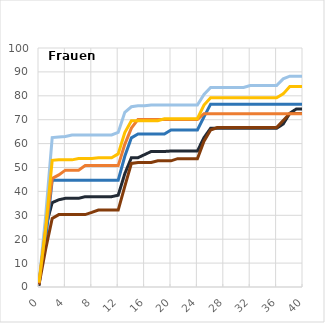
| Category | 1,00 Nichtmigranten - max einfacher Hauptschulabschluss | 2,00 Nichtmigranten - qualifizierender Hauptschulabschluss | 3,00 Nichtmigranten - mittlerer Schulabschluss | 4,00 Migranten - max einfacher Hauptschulabschluss | 5,00 Migranten - qualifizierender Hauptschulabschluss | 6,00 Migranten - mittlerer Schulabschluss |
|---|---|---|---|---|---|---|
| 0.0 | 0.5 | 2.5 | 1.7 | 0.9 | 1.5 | 1.9 |
| 1.0 | 24.9 | 19.2 | 29.4 | 15.7 | 23.9 | 24.3 |
| 2.0 | 35.3 | 44.7 | 62.5 | 28.7 | 45.4 | 53 |
| 3.0 | 36.5 | 44.7 | 62.8 | 30.3 | 46.9 | 53.2 |
| 4.0 | 37.1 | 44.7 | 63 | 30.3 | 48.9 | 53.2 |
| 5.0 | 37.1 | 44.7 | 63.6 | 30.3 | 48.9 | 53.2 |
| 6.0 | 37.1 | 44.7 | 63.6 | 30.3 | 48.9 | 53.8 |
| 7.0 | 37.8 | 44.7 | 63.6 | 30.3 | 50.8 | 53.8 |
| 8.0 | 37.8 | 44.7 | 63.6 | 31.2 | 50.8 | 53.8 |
| 9.0 | 37.8 | 44.7 | 63.6 | 32.2 | 50.8 | 54.1 |
| 10.0 | 37.8 | 44.7 | 63.6 | 32.2 | 50.8 | 54.1 |
| 11.0 | 37.8 | 44.7 | 63.6 | 32.2 | 50.8 | 54.1 |
| 12.0 | 38.4 | 44.7 | 64.7 | 32.2 | 50.8 | 55.7 |
| 13.0 | 47.4 | 54.7 | 73.1 | 42.1 | 59.7 | 64.6 |
| 14.0 | 54.1 | 62.4 | 75.4 | 51.7 | 66.5 | 69.6 |
| 15.0 | 54.1 | 64 | 75.8 | 52.1 | 70.1 | 69.6 |
| 16.0 | 55.4 | 64 | 75.8 | 52.1 | 70.1 | 69.6 |
| 17.0 | 56.7 | 64 | 76.1 | 52.1 | 70.1 | 69.6 |
| 18.0 | 56.7 | 64 | 76.1 | 52.8 | 70.1 | 69.6 |
| 19.0 | 56.7 | 64 | 76.1 | 52.8 | 70.1 | 70.4 |
| 20.0 | 56.9 | 65.7 | 76.1 | 52.8 | 70.1 | 70.4 |
| 21.0 | 56.9 | 65.7 | 76.1 | 53.7 | 70.1 | 70.4 |
| 22.0 | 56.9 | 65.7 | 76.1 | 53.7 | 70.1 | 70.4 |
| 23.0 | 56.9 | 65.7 | 76.1 | 53.7 | 70.1 | 70.4 |
| 24.0 | 56.9 | 65.7 | 76.1 | 53.7 | 70.1 | 70.4 |
| 25.0 | 62.5 | 71.2 | 80.6 | 61 | 72.5 | 76.1 |
| 26.0 | 66.4 | 76.5 | 83.5 | 65.7 | 72.5 | 79.2 |
| 27.0 | 66.4 | 76.5 | 83.5 | 66.7 | 72.5 | 79.2 |
| 28.0 | 66.4 | 76.5 | 83.5 | 66.7 | 72.5 | 79.2 |
| 29.0 | 66.4 | 76.5 | 83.5 | 66.7 | 72.5 | 79.2 |
| 30.0 | 66.4 | 76.5 | 83.5 | 66.7 | 72.5 | 79.2 |
| 31.0 | 66.4 | 76.5 | 83.5 | 66.7 | 72.5 | 79.2 |
| 32.0 | 66.4 | 76.5 | 84.3 | 66.7 | 72.5 | 79.2 |
| 33.0 | 66.4 | 76.5 | 84.3 | 66.7 | 72.5 | 79.2 |
| 34.0 | 66.4 | 76.5 | 84.3 | 66.7 | 72.5 | 79.2 |
| 35.0 | 66.4 | 76.5 | 84.3 | 66.7 | 72.5 | 79.2 |
| 36.0 | 66.4 | 76.5 | 84.3 | 66.7 | 72.5 | 79.2 |
| 37.0 | 68.2 | 76.5 | 87.1 | 69.7 | 72.5 | 80.8 |
| 38.0 | 72.7 | 76.5 | 88.2 | 72.6 | 72.5 | 83.9 |
| 39.0 | 74.5 | 76.5 | 88.2 | 72.6 | 72.5 | 83.9 |
| 40.0 | 74.5 | 76.5 | 88.2 | 72.6 | 72.5 | 83.9 |